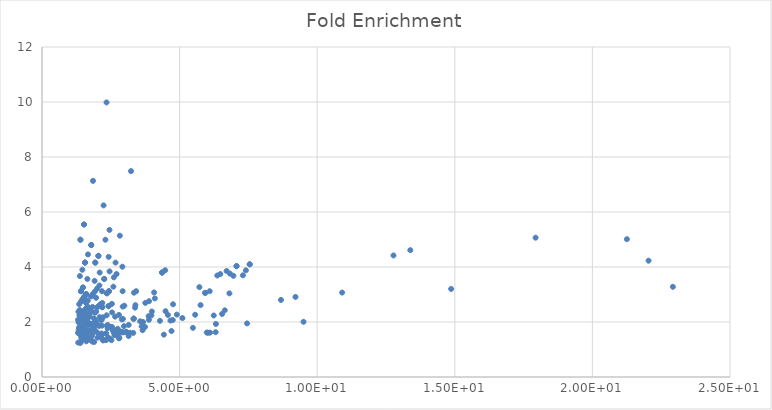
| Category | Fold Enrichment |
|---|---|
| 22.92445303860747 | 3.28 |
| 22.040958607678906 | 4.229 |
| 21.253365801062422 | 5.012 |
| 17.93554201077308 | 5.066 |
| 14.866461091629782 | 3.201 |
| 13.3829996588791 | 4.612 |
| 12.772113295386326 | 4.42 |
| 10.906578314837764 | 3.07 |
| 9.503070351926786 | 2.008 |
| 9.211124884224583 | 2.912 |
| 8.684029654543082 | 2.803 |
| 7.548213564475709 | 4.098 |
| 7.548213564475709 | 4.098 |
| 7.450996737974212 | 1.948 |
| 7.407823242604133 | 3.879 |
| 7.301029995663981 | 3.698 |
| 7.068033885271827 | 4.032 |
| 7.068033885271827 | 4.032 |
| 6.954677021213342 | 3.68 |
| 6.826813731587726 | 3.761 |
| 6.809668301829708 | 3.041 |
| 6.707743928643524 | 3.854 |
| 6.642065152999546 | 2.425 |
| 6.543633966870957 | 2.292 |
| 6.478861916295964 | 3.744 |
| 6.369572124974976 | 3.691 |
| 6.319664486585437 | 1.929 |
| 6.31069114087638 | 1.63 |
| 6.2403321553103694 | 2.237 |
| 6.106793246940152 | 1.614 |
| 6.094204119632131 | 3.12 |
| 6.031984286006359 | 1.608 |
| 5.987162775294828 | 1.617 |
| 5.928117992693875 | 3.059 |
| 5.928117992693875 | 3.059 |
| 5.761953896871205 | 2.614 |
| 5.718966632752273 | 3.268 |
| 5.5638373529592435 | 2.264 |
| 5.484126156288321 | 1.787 |
| 5.104025267640935 | 2.142 |
| 4.8996294548824375 | 2.269 |
| 4.761953896871205 | 2.644 |
| 4.752026733638194 | 2.071 |
| 4.705533773838407 | 1.672 |
| 4.667561540084395 | 2.054 |
| 4.575118363368933 | 2.256 |
| 4.489454989793388 | 2.393 |
| 4.476253533188435 | 3.883 |
| 4.42712839779952 | 1.54 |
| 4.364516253185088 | 3.798 |
| 4.364516253185088 | 3.798 |
| 4.364516253185088 | 3.798 |
| 4.286509456906058 | 2.043 |
| 4.099086932262331 | 2.857 |
| 4.073657553374345 | 3.075 |
| 3.9913998282380825 | 2.382 |
| 3.9746941347352296 | 2.24 |
| 3.889410289700751 | 2.757 |
| 3.886056647693163 | 2.08 |
| 3.876148359032914 | 2.212 |
| 3.75448733218585 | 2.694 |
| 3.7423214251308154 | 1.819 |
| 3.6716203965612624 | 1.999 |
| 3.6556077263148894 | 1.702 |
| 3.619788758288394 | 1.842 |
| 3.5654310959658013 | 2.026 |
| 3.421360790031928 | 3.12 |
| 3.3946949538588904 | 2.612 |
| 3.381951903287907 | 2.522 |
| 3.3419886033428874 | 3.065 |
| 3.329754146925876 | 2.121 |
| 3.329754146925876 | 2.121 |
| 3.329754146925876 | 2.121 |
| 3.316052869248488 | 1.603 |
| 3.234331445240986 | 7.488 |
| 3.1944991418415998 | 1.609 |
| 3.1505805862031004 | 1.893 |
| 3.148130399270234 | 1.491 |
| 3.1249387366083 | 1.598 |
| 3.0609802235513337 | 1.643 |
| 3.0604807473813813 | 1.632 |
| 2.993083637517453 | 2.593 |
| 2.9792543214116423 | 1.849 |
| 2.9590532878098625 | 1.625 |
| 2.9413439818593425 | 2.111 |
| 2.933012140461802 | 2.56 |
| 2.929244569769057 | 3.12 |
| 2.921352540241882 | 4.011 |
| 2.898580832198135 | 2.095 |
| 2.89240781587179 | 1.644 |
| 2.88513725132701 | 1.622 |
| 2.8277305060988764 | 5.139 |
| 2.810175742045883 | 1.425 |
| 2.7968944645339295 | 1.648 |
| 2.796360721553247 | 2.258 |
| 2.7956189762544468 | 1.406 |
| 2.76312606410032 | 1.599 |
| 2.754651704267841 | 1.538 |
| 2.7523335471316344 | 1.753 |
| 2.738682877532392 | 1.585 |
| 2.7376825416425064 | 1.595 |
| 2.7087768269333776 | 3.744 |
| 2.689828579225715 | 1.528 |
| 2.672346049964406 | 4.16 |
| 2.655125750123401 | 2.196 |
| 2.648532242890239 | 1.521 |
| 2.632969455711137 | 1.541 |
| 2.6191233500988167 | 1.613 |
| 2.6102364185580402 | 3.623 |
| 2.610229160825533 | 1.673 |
| 2.5940034535559997 | 3.284 |
| 2.583472823364002 | 1.667 |
| 2.554220402083794 | 1.759 |
| 2.546683647925211 | 2.349 |
| 2.542094043715518 | 1.82 |
| 2.5394574021014997 | 2.66 |
| 2.5229938485699015 | 1.34 |
| 2.5100555756401968 | 1.811 |
| 2.5100555756401968 | 1.811 |
| 2.5100555756401968 | 1.811 |
| 2.4777943679436523 | 1.389 |
| 2.4547178778389602 | 3.84 |
| 2.4516663618832397 | 5.348 |
| 2.4332212169449536 | 1.812 |
| 2.432107439293196 | 3.12 |
| 2.432107439293196 | 3.12 |
| 2.4222440272685026 | 4.368 |
| 2.418410185202871 | 2.575 |
| 2.418410185202871 | 2.575 |
| 2.4004450642236894 | 1.884 |
| 2.3998473780091487 | 1.44 |
| 2.385417445196294 | 1.774 |
| 2.376418601338664 | 1.846 |
| 2.366217753797658 | 1.872 |
| 2.366217753797658 | 1.872 |
| 2.3557944754946774 | 3.044 |
| 2.3557944754946774 | 3.044 |
| 2.349998145070573 | 2.244 |
| 2.344448989298892 | 9.984 |
| 2.3293067200941477 | 1.585 |
| 2.3293067200941477 | 1.585 |
| 2.328533714118053 | 1.343 |
| 2.304847408718098 | 4.992 |
| 2.260518241896769 | 3.566 |
| 2.260518241896769 | 3.566 |
| 2.245476223350417 | 1.343 |
| 2.2370224086039827 | 6.24 |
| 2.218797715820416 | 1.331 |
| 2.212638085379681 | 2.17 |
| 2.191242956474548 | 1.555 |
| 2.1908543754559577 | 2.692 |
| 2.187105351830089 | 2.538 |
| 2.187105351830089 | 2.538 |
| 2.1865656689520705 | 1.392 |
| 2.181242256432833 | 3.12 |
| 2.1771707137935286 | 1.868 |
| 2.1598698066336897 | 1.582 |
| 2.1595365755096383 | 2.08 |
| 2.1595365755096383 | 2.08 |
| 2.1513834519556156 | 1.536 |
| 2.129588602913128 | 2.64 |
| 2.129588602913128 | 2.64 |
| 2.099125453054073 | 1.872 |
| 2.0963493209183643 | 3.798 |
| 2.0940094590673564 | 2.177 |
| 2.086031259220094 | 3.328 |
| 2.072925838487445 | 1.484 |
| 2.070237096033735 | 2.59 |
| 2.0655515965041884 | 1.859 |
| 2.0491883735294047 | 4.405 |
| 2.0491883735294047 | 4.405 |
| 2.016500953188516 | 1.431 |
| 2.0127190518839138 | 2.542 |
| 2.011222256626497 | 1.912 |
| 2.0052484181911088 | 3.221 |
| 1.9880051109894805 | 1.638 |
| 1.9713602740626526 | 2.377 |
| 1.9655027337553792 | 2.88 |
| 1.9613800764553848 | 2.038 |
| 1.936920873435864 | 4.16 |
| 1.936920873435864 | 4.16 |
| 1.9283563679973466 | 3.12 |
| 1.921064091044614 | 2.34 |
| 1.9118116218465417 | 3.494 |
| 1.9025728591766702 | 1.712 |
| 1.8926782478393127 | 1.273 |
| 1.8891630815469709 | 1.822 |
| 1.8876434484301807 | 2.131 |
| 1.8575108891227596 | 1.809 |
| 1.855083348476401 | 3.025 |
| 1.8534369571421072 | 7.131 |
| 1.8531467090489313 | 1.929 |
| 1.8531467090489313 | 1.929 |
| 1.8438567735416775 | 1.771 |
| 1.8368551798328336 | 2.547 |
| 1.829355628516408 | 1.287 |
| 1.8232107250342422 | 1.56 |
| 1.8179005108666373 | 1.911 |
| 1.8072692012652032 | 1.477 |
| 1.7995310171840864 | 2.367 |
| 1.7890608532935801 | 4.8 |
| 1.7890608532935801 | 4.8 |
| 1.7851847262914484 | 2.936 |
| 1.7851847262914484 | 2.936 |
| 1.7734081364029006 | 1.939 |
| 1.7531250214709315 | 1.359 |
| 1.7531250214709315 | 1.359 |
| 1.7379441081485023 | 1.92 |
| 1.7329665870684856 | 2.202 |
| 1.7282847985188678 | 2.447 |
| 1.7282847985188678 | 2.447 |
| 1.7209581460506151 | 1.695 |
| 1.693113343016367 | 1.95 |
| 1.688997821943197 | 2.17 |
| 1.6707918277222396 | 4.457 |
| 1.6690241183403496 | 1.884 |
| 1.667044936030744 | 1.674 |
| 1.6591803530939084 | 2.553 |
| 1.6591803530939084 | 2.553 |
| 1.6555867195468745 | 2.25 |
| 1.6555867195468745 | 2.25 |
| 1.6546475239212008 | 2.773 |
| 1.6546475239212008 | 2.773 |
| 1.6480052341929872 | 3.566 |
| 1.6454834197981512 | 1.447 |
| 1.644725567124367 | 2.054 |
| 1.631140298705757 | 1.427 |
| 1.6260292971250732 | 1.443 |
| 1.6255531076499963 | 1.481 |
| 1.6208897682656063 | 1.575 |
| 1.6152132425268197 | 1.61 |
| 1.6089343946550714 | 1.438 |
| 1.6086622097188972 | 1.299 |
| 1.604669604798733 | 2.496 |
| 1.6028114667777993 | 1.553 |
| 1.6017704655526188 | 3.012 |
| 1.6017704655526188 | 3.012 |
| 1.6017704655526188 | 3.012 |
| 1.593626484373391 | 2.698 |
| 1.5783504417058083 | 2.311 |
| 1.5783504417058083 | 2.311 |
| 1.5783504417058083 | 2.311 |
| 1.5761892061090592 | 1.941 |
| 1.570710077959138 | 1.718 |
| 1.5676792052963995 | 2.003 |
| 1.5653438626299327 | 1.526 |
| 1.5638588136820082 | 4.16 |
| 1.5638588136820082 | 4.16 |
| 1.5638588136820082 | 4.16 |
| 1.5521488451950454 | 2.442 |
| 1.5343181683466147 | 2.912 |
| 1.5343181683466147 | 2.912 |
| 1.5315319406865189 | 2.269 |
| 1.5315319406865189 | 2.269 |
| 1.5315319406865189 | 2.269 |
| 1.5257989802190766 | 5.547 |
| 1.5257989802190766 | 5.547 |
| 1.5236747688872168 | 2.145 |
| 1.5216203200646043 | 1.853 |
| 1.5038393740197877 | 1.376 |
| 1.5015219235769794 | 2.39 |
| 1.4982302134847902 | 1.753 |
| 1.4941930512814574 | 1.955 |
| 1.4941930512814574 | 1.955 |
| 1.4885321167609513 | 1.682 |
| 1.4872304872046613 | 1.653 |
| 1.4870338572818327 | 3.256 |
| 1.4870338572818327 | 3.256 |
| 1.4861862671546437 | 2.229 |
| 1.4861862671546437 | 2.229 |
| 1.4861862671546437 | 2.229 |
| 1.4702904086079744 | 2.818 |
| 1.4702904086079744 | 2.818 |
| 1.4665908777781147 | 3.9 |
| 1.4630720971967865 | 1.447 |
| 1.462004101242756 | 1.67 |
| 1.4587246063848223 | 1.931 |
| 1.4587246063848223 | 1.931 |
| 1.457742999564768 | 1.817 |
| 1.4526992540038368 | 2.34 |
| 1.4526992540038368 | 2.34 |
| 1.4479618826010272 | 1.997 |
| 1.4468638738896522 | 1.568 |
| 1.4422548073812438 | 2.189 |
| 1.44179985149558 | 2.08 |
| 1.4408688458505443 | 1.725 |
| 1.435354479427819 | 1.395 |
| 1.4303866623040713 | 1.544 |
| 1.4219270137574063 | 1.481 |
| 1.418130509847801 | 1.752 |
| 1.414189742082775 | 3.12 |
| 1.414189742082775 | 3.12 |
| 1.4112801868118179 | 1.97 |
| 1.4104780822359735 | 1.676 |
| 1.4094430903308484 | 2.73 |
| 1.399682185485244 | 2.152 |
| 1.3970423166545771 | 1.248 |
| 1.396998654029514 | 4.992 |
| 1.396998654029514 | 4.992 |
| 1.3935697687595905 | 1.246 |
| 1.3893521846738637 | 1.736 |
| 1.377660112064621 | 3.671 |
| 1.3741322336922976 | 2.435 |
| 1.3677696328095752 | 1.579 |
| 1.3677696328095752 | 1.579 |
| 1.3666177856869866 | 1.766 |
| 1.3666177856869866 | 1.766 |
| 1.3643972104843927 | 2.019 |
| 1.3601378292450357 | 2.246 |
| 1.3515567393306434 | 2.647 |
| 1.3449929206989635 | 1.801 |
| 1.3333931104952275 | 1.707 |
| 1.3272805572766786 | 1.99 |
| 1.3247346852568636 | 2.377 |
| 1.31840698183985 | 2.08 |
| 1.31840698183985 | 2.08 |
| 1.317299436264766 | 1.25 |
| 1.3114383434956072 | 1.602 |